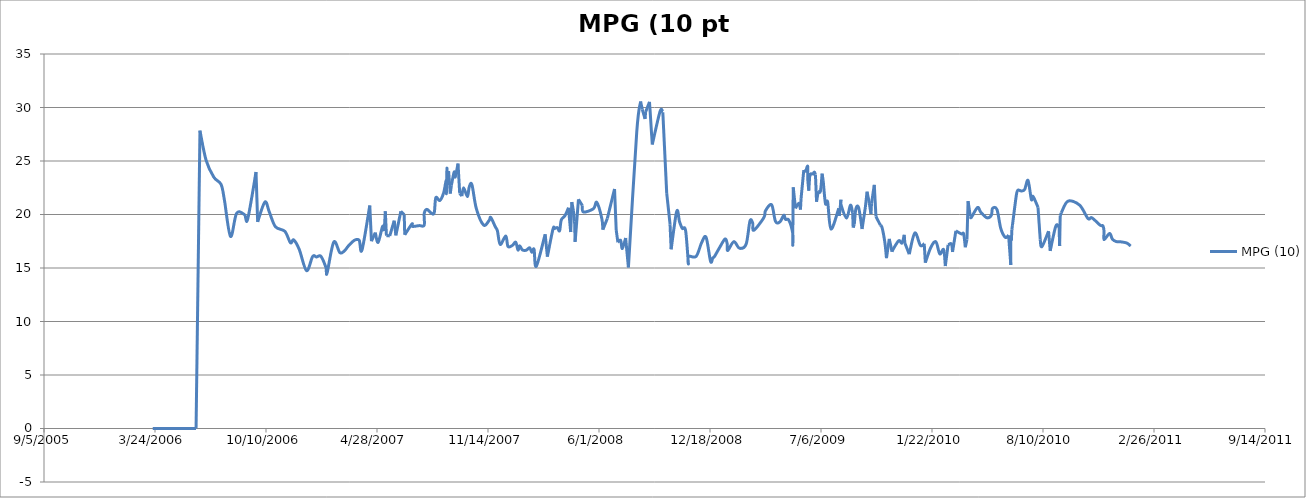
| Category | MPG (10) |
|---|---|
| 38796.0 | 0 |
| 38799.0 | 0 |
| 38801.0 | 0 |
| 38809.0 | 0 |
| 38831.0 | 0 |
| 38849.0 | 0 |
| 38856.0 | 0 |
| 38868.0 | 0 |
| 38874.0 | 0 |
| 38881.0 | 27.837 |
| 38892.0 | 25.08 |
| 38906.0 | 23.487 |
| 38919.0 | 22.813 |
| 38925.0 | 21.377 |
| 38936.0 | 17.956 |
| 38947.0 | 20.111 |
| 38961.0 | 20.002 |
| 38967.0 | 19.574 |
| 38982.0 | 23.972 |
| 38985.0 | 19.315 |
| 38998.0 | 21.166 |
| 39006.0 | 20.232 |
| 39017.0 | 18.856 |
| 39034.0 | 18.426 |
| 39044.0 | 17.361 |
| 39050.0 | 17.622 |
| 39060.0 | 16.722 |
| 39073.0 | 14.752 |
| 39084.0 | 16.073 |
| 39091.0 | 16.031 |
| 39099.0 | 16.093 |
| 39108.0 | 15.054 |
| 39110.0 | 14.523 |
| 39122.0 | 17.417 |
| 39133.0 | 16.44 |
| 39141.0 | 16.585 |
| 39148.0 | 17.036 |
| 39155.0 | 17.413 |
| 39161.0 | 17.63 |
| 39168.0 | 17.584 |
| 39173.0 | 16.688 |
| 39187.0 | 20.842 |
| 39190.0 | 17.505 |
| 39197.0 | 18.309 |
| 39202.0 | 17.394 |
| 39210.0 | 18.88 |
| 39213.0 | 18.456 |
| 39215.0 | 20.304 |
| 39217.0 | 18.027 |
| 39223.0 | 17.999 |
| 39231.0 | 19.425 |
| 39234.0 | 18.049 |
| 39243.0 | 20.3 |
| 39249.0 | 19.975 |
| 39250.0 | 18.103 |
| 39263.0 | 19.115 |
| 39264.0 | 18.885 |
| 39276.0 | 18.962 |
| 39285.0 | 18.989 |
| 39285.0 | 20.087 |
| 39290.0 | 20.481 |
| 39297.0 | 20.161 |
| 39303.0 | 20.145 |
| 39306.0 | 21.571 |
| 39313.0 | 21.302 |
| 39320.0 | 22.01 |
| 39325.0 | 23.243 |
| 39325.0 | 21.959 |
| 39326.0 | 24.304 |
| 39326.0 | 23.315 |
| 39328.0 | 23.04 |
| 39329.0 | 24.063 |
| 39332.0 | 21.955 |
| 39334.0 | 22.71 |
| 39339.0 | 23.97 |
| 39341.0 | 23.512 |
| 39346.0 | 24.76 |
| 39349.0 | 21.977 |
| 39353.0 | 21.722 |
| 39356.0 | 22.49 |
| 39363.0 | 21.669 |
| 39366.0 | 22.537 |
| 39371.0 | 22.788 |
| 39379.0 | 20.546 |
| 39392.0 | 19.019 |
| 39402.0 | 19.444 |
| 39405.0 | 19.725 |
| 39413.0 | 18.867 |
| 39417.0 | 18.46 |
| 39422.0 | 17.199 |
| 39432.0 | 17.991 |
| 39436.0 | 17.015 |
| 39444.0 | 17.112 |
| 39450.0 | 17.406 |
| 39454.0 | 16.672 |
| 39457.0 | 17.076 |
| 39462.0 | 16.692 |
| 39469.0 | 16.667 |
| 39475.0 | 16.89 |
| 39479.0 | 16.474 |
| 39483.0 | 16.742 |
| 39487.0 | 15.161 |
| 39503.0 | 18.152 |
| 39507.0 | 16.061 |
| 39517.0 | 18.622 |
| 39520.0 | 18.692 |
| 39525.0 | 18.771 |
| 39529.0 | 18.473 |
| 39532.0 | 19.487 |
| 39539.0 | 19.913 |
| 39545.0 | 20.632 |
| 39549.0 | 18.36 |
| 39551.0 | 21.163 |
| 39554.0 | 20.332 |
| 39556.0 | 19.317 |
| 39557.0 | 17.439 |
| 39563.0 | 21.421 |
| 39570.0 | 20.83 |
| 39572.0 | 20.231 |
| 39590.0 | 20.541 |
| 39596.0 | 21.136 |
| 39605.0 | 19.644 |
| 39607.0 | 18.585 |
| 39615.0 | 19.63 |
| 39628.0 | 22.386 |
| 39631.0 | 18.548 |
| 39634.0 | 17.407 |
| 39639.0 | 17.579 |
| 39642.0 | 16.816 |
| 39648.0 | 17.806 |
| 39653.0 | 15.055 |
| 39668.0 | 27.692 |
| 39675.0 | 30.564 |
| 39678.0 | 29.82 |
| 39683.0 | 28.93 |
| 39684.0 | 29.577 |
| 39691.0 | 30.524 |
| 39696.0 | 26.54 |
| 39710.0 | 29.626 |
| 39715.0 | 29.557 |
| 39722.0 | 22.002 |
| 39728.0 | 19.098 |
| 39730.0 | 16.746 |
| 39740.0 | 20.296 |
| 39745.0 | 19.346 |
| 39750.0 | 18.705 |
| 39756.0 | 18.506 |
| 39761.0 | 15.475 |
| 39761.0 | 16.098 |
| 39775.0 | 16.085 |
| 39785.0 | 17.384 |
| 39793.0 | 17.861 |
| 39801.0 | 15.625 |
| 39805.0 | 15.938 |
| 39808.0 | 16.067 |
| 39817.0 | 16.884 |
| 39827.0 | 17.707 |
| 39831.0 | 17.259 |
| 39832.0 | 16.636 |
| 39843.0 | 17.465 |
| 39853.0 | 16.848 |
| 39865.0 | 17.216 |
| 39872.0 | 19.388 |
| 39877.0 | 19.188 |
| 39879.0 | 18.526 |
| 39897.0 | 19.708 |
| 39900.0 | 20.35 |
| 39911.0 | 20.908 |
| 39918.0 | 19.359 |
| 39926.0 | 19.311 |
| 39933.0 | 19.935 |
| 39936.0 | 19.548 |
| 39942.0 | 19.474 |
| 39949.0 | 18.269 |
| 39949.0 | 17.326 |
| 39950.0 | 22.538 |
| 39954.0 | 20.582 |
| 39960.0 | 21.048 |
| 39963.0 | 20.46 |
| 39964.0 | 21.455 |
| 39969.0 | 24.152 |
| 39972.0 | 23.932 |
| 39976.0 | 24.518 |
| 39976.0 | 23.431 |
| 39978.0 | 22.225 |
| 39980.0 | 23.878 |
| 39984.0 | 23.681 |
| 39988.0 | 23.973 |
| 39990.0 | 23.722 |
| 39992.0 | 21.187 |
| 39995.0 | 22.17 |
| 39999.0 | 22.184 |
| 40002.0 | 23.818 |
| 40004.0 | 23.135 |
| 40008.0 | 21.024 |
| 40012.0 | 21.159 |
| 40018.0 | 18.641 |
| 40032.0 | 20.575 |
| 40033.0 | 19.858 |
| 40036.0 | 21.382 |
| 40036.0 | 20.928 |
| 40046.0 | 19.66 |
| 40053.0 | 20.87 |
| 40057.0 | 20.154 |
| 40058.0 | 18.777 |
| 40060.0 | 19.079 |
| 40063.0 | 20.568 |
| 40068.0 | 20.596 |
| 40074.0 | 18.643 |
| 40080.0 | 20.698 |
| 40083.0 | 22.132 |
| 40087.0 | 21.073 |
| 40090.0 | 20.055 |
| 40091.0 | 21.007 |
| 40096.0 | 22.771 |
| 40099.0 | 19.816 |
| 40107.0 | 18.999 |
| 40110.0 | 18.786 |
| 40115.0 | 17.406 |
| 40118.0 | 15.919 |
| 40123.0 | 17.723 |
| 40128.0 | 16.521 |
| 40130.0 | 16.75 |
| 40140.0 | 17.544 |
| 40146.0 | 17.333 |
| 40150.0 | 18.099 |
| 40151.0 | 17.341 |
| 40159.0 | 16.293 |
| 40169.0 | 18.27 |
| 40179.0 | 17.121 |
| 40186.0 | 17.268 |
| 40188.0 | 15.499 |
| 40198.0 | 16.938 |
| 40207.0 | 17.447 |
| 40214.0 | 16.318 |
| 40221.0 | 16.717 |
| 40224.0 | 15.183 |
| 40229.0 | 17.167 |
| 40235.0 | 17.246 |
| 40237.0 | 16.501 |
| 40243.0 | 18.472 |
| 40253.0 | 18.181 |
| 40257.0 | 18.187 |
| 40260.0 | 16.938 |
| 40263.0 | 17.664 |
| 40265.0 | 21.253 |
| 40269.0 | 19.826 |
| 40271.0 | 19.74 |
| 40282.0 | 20.651 |
| 40288.0 | 20.207 |
| 40299.0 | 19.694 |
| 40307.0 | 19.936 |
| 40309.0 | 20.566 |
| 40317.0 | 20.468 |
| 40324.0 | 18.686 |
| 40332.0 | 17.871 |
| 40338.0 | 18.057 |
| 40342.0 | 15.279 |
| 40342.0 | 17.713 |
| 40343.0 | 17.556 |
| 40344.0 | 18.617 |
| 40345.0 | 19.007 |
| 40352.0 | 21.815 |
| 40355.0 | 22.275 |
| 40361.0 | 22.198 |
| 40367.0 | 22.343 |
| 40373.0 | 23.186 |
| 40379.0 | 21.41 |
| 40382.0 | 21.693 |
| 40391.0 | 20.676 |
| 40395.0 | 17.682 |
| 40398.0 | 16.992 |
| 40410.0 | 18.437 |
| 40413.0 | 16.599 |
| 40423.0 | 18.899 |
| 40429.0 | 18.824 |
| 40430.0 | 17.048 |
| 40431.0 | 19.869 |
| 40433.0 | 20.159 |
| 40445.0 | 21.247 |
| 40466.0 | 20.872 |
| 40481.0 | 19.626 |
| 40488.0 | 19.693 |
| 40503.0 | 19 |
| 40508.0 | 18.94 |
| 40510.0 | 18.43 |
| 40510.0 | 17.653 |
| 40520.0 | 18.231 |
| 40525.0 | 17.696 |
| 40532.0 | 17.47 |
| 40540.0 | 17.447 |
| 40551.0 | 17.333 |
| 40558.0 | 17.053 |